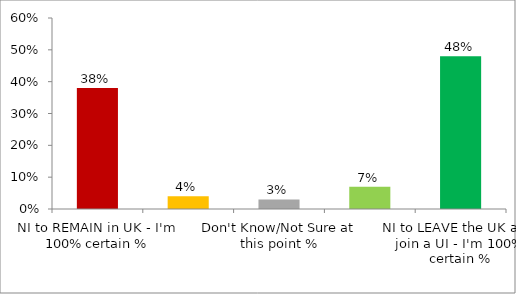
| Category | Share |
|---|---|
| NI to REMAIN in UK - I'm 100% certain % | 0.38 |
| NI to REMAIN in UK - My probable vote, but I'm not certain % | 0.04 |
| Don't Know/Not Sure at this point % | 0.03 |
| NI to LEAVE the UK and join a UI - My probable vote, but I'm not certain % | 0.07 |
| NI to LEAVE the UK and join a UI - I'm 100% certain % | 0.48 |